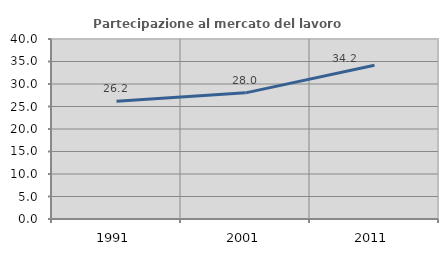
| Category | Partecipazione al mercato del lavoro  femminile |
|---|---|
| 1991.0 | 26.173 |
| 2001.0 | 28.032 |
| 2011.0 | 34.16 |